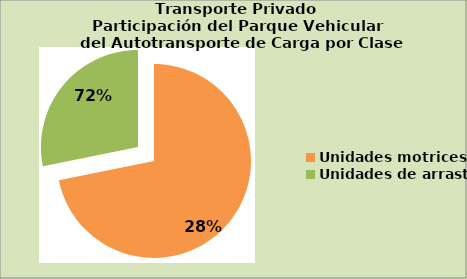
| Category | Series 0 |
|---|---|
| Unidades motrices | 71.82 |
| Unidades de arrastre | 28.157 |